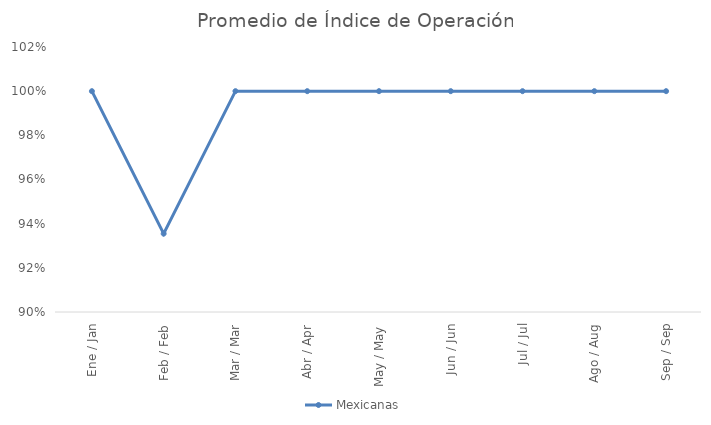
| Category | Mexicanas |
|---|---|
| Ene / Jan | 1 |
| Feb / Feb | 0.935 |
| Mar / Mar | 1 |
| Abr / Apr | 1 |
| May / May | 1 |
| Jun / Jun | 1 |
| Jul / Jul | 1 |
| Ago / Aug | 1 |
| Sep / Sep | 1 |